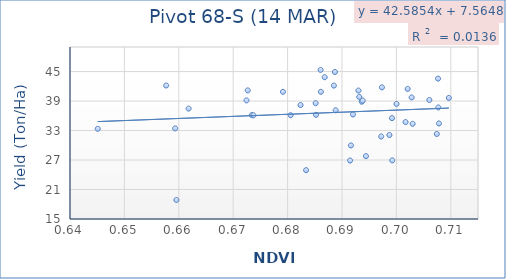
| Category | Series 0 |
|---|---|
| 0.688179 | 39.83 |
| 0.702653 | 43.563 |
| 0.680158 | 38.557 |
| 0.689407 | 27.79 |
| 0.688025 | 41.133 |
| 0.68863 | 38.86 |
| 0.683835 | 37.12 |
| 0.6978 | 39.733 |
| 0.688794 | 39.09 |
| 0.696687 | 34.72 |
| 0.681062 | 45.34 |
| 0.652679 | 42.167 |
| 0.677375 | 38.18 |
| 0.668428 | 36.147 |
| 0.686638 | 29.967 |
| 0.678401 | 24.933 |
| 0.654563 | 18.867 |
| 0.667674 | 41.167 |
| 0.697985 | 34.367 |
| 0.681823 | 43.853 |
| 0.654329 | 33.437 |
| 0.674146 | 40.877 |
| 0.687013 | 36.27 |
| 0.694191 | 35.523 |
| 0.692338 | 41.79 |
| 0.683506 | 42.147 |
| 0.704642 | 39.63 |
| 0.702424 | 32.297 |
| 0.69707 | 41.467 |
| 0.695014 | 38.41 |
| 0.675561 | 36.117 |
| 0.694237 | 26.927 |
| 0.702704 | 37.697 |
| 0.686485 | 26.893 |
| 0.668722 | 36.093 |
| 0.681119 | 40.88 |
| 0.6568 | 37.467 |
| 0.683698 | 44.913 |
| 0.640105 | 33.35 |
| 0.701058 | 39.217 |
| 0.692203 | 31.79 |
| 0.667447 | 39.14 |
| 0.702828 | 34.44 |
| 0.680222 | 36.193 |
| 0.693715 | 32.093 |